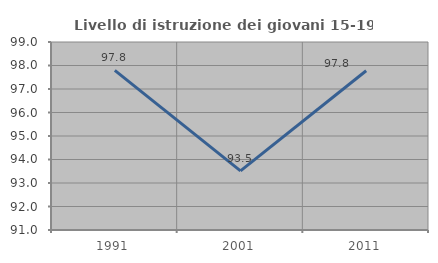
| Category | Livello di istruzione dei giovani 15-19 anni |
|---|---|
| 1991.0 | 97.794 |
| 2001.0 | 93.519 |
| 2011.0 | 97.778 |